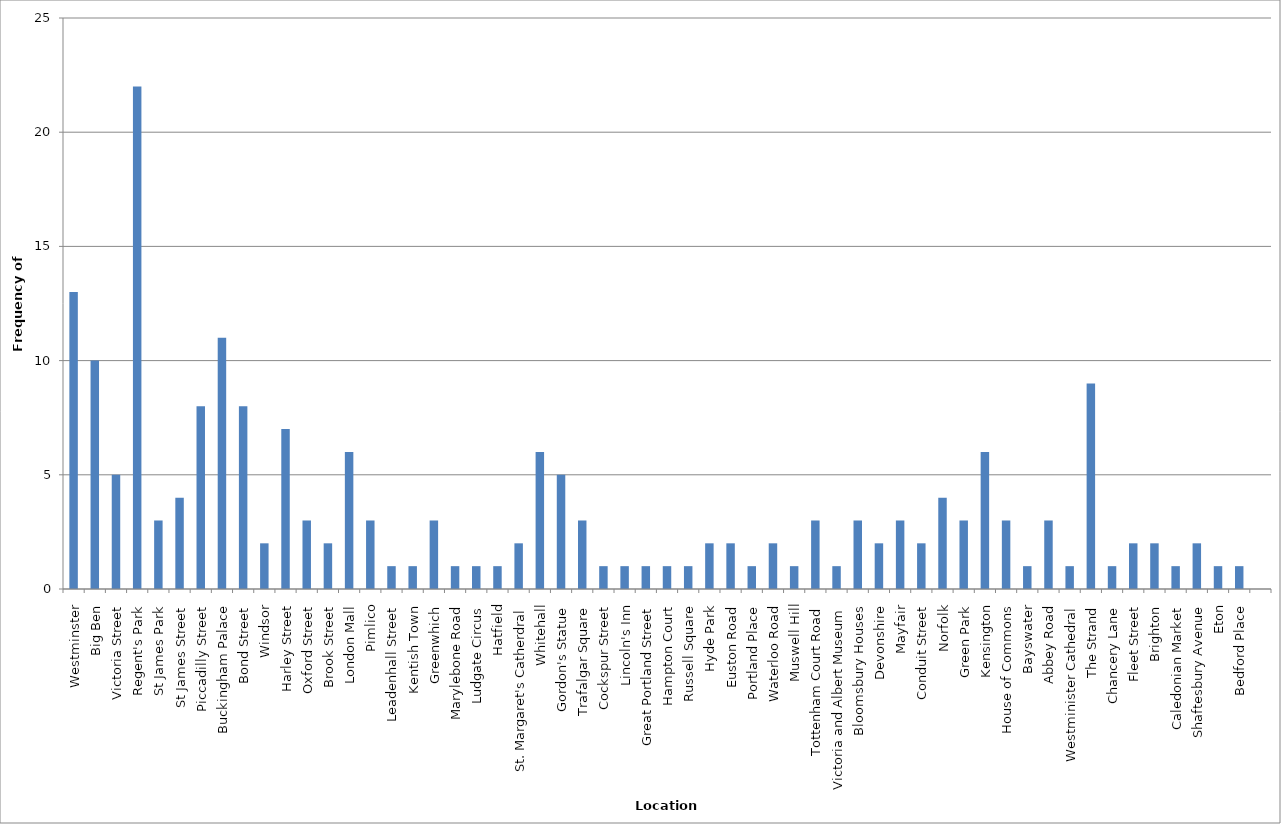
| Category | Series 0 |
|---|---|
| Westminster | 13 |
| Big Ben | 10 |
| Victoria Street | 5 |
| Regent's Park | 22 |
| St James Park | 3 |
| St James Street | 4 |
| Piccadilly Street | 8 |
| Buckingham Palace | 11 |
| Bond Street | 8 |
| Windsor | 2 |
| Harley Street | 7 |
| Oxford Street | 3 |
| Brook Street | 2 |
| London Mall | 6 |
| Pimlico | 3 |
| Leadenhall Street | 1 |
| Kentish Town | 1 |
| Greenwhich | 3 |
| Marylebone Road | 1 |
| Ludgate Circus | 1 |
| Hatfield | 1 |
| St. Margaret's Catherdral | 2 |
| Whitehall | 6 |
| Gordon's Statue | 5 |
| Trafalgar Square | 3 |
| Cockspur Street | 1 |
| Lincoln's Inn | 1 |
| Great Portland Street | 1 |
| Hampton Court | 1 |
| Russell Square | 1 |
| Hyde Park | 2 |
| Euston Road | 2 |
| Portland Place | 1 |
| Waterloo Road | 2 |
| Muswell Hill | 1 |
| Tottenham Court Road | 3 |
| Victoria and Albert Museum | 1 |
| Bloomsbury Houses | 3 |
| Devonshire | 2 |
| Mayfair | 3 |
| Conduit Street | 2 |
| Norfolk | 4 |
| Green Park | 3 |
| Kensington | 6 |
| House of Commons | 3 |
| Bayswater | 1 |
| Abbey Road | 3 |
| Westminister Cathedral | 1 |
| The Strand | 9 |
| Chancery Lane | 1 |
| Fleet Street | 2 |
| Brighton | 2 |
| Caledonian Market | 1 |
| Shaftesbury Avenue | 2 |
| Eton | 1 |
| Bedford Place | 1 |